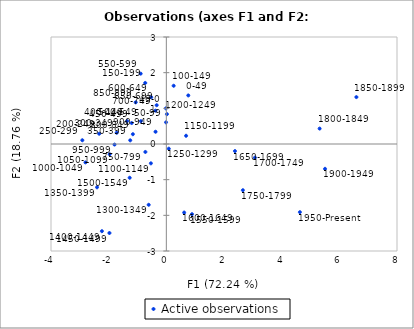
| Category | Active observations |
|---|---|
| 4.632232552843128 | -1.911 |
| 5.503655741676742 | -0.696 |
| 6.591649991115136 | 1.315 |
| 5.31668852765911 | 0.432 |
| 2.6547874400038287 | -1.296 |
| 3.073148568334322 | -0.382 |
| 2.3801209543622783 | -0.199 |
| 0.618510884195647 | -1.922 |
| 0.8901042034635558 | -1.968 |
| -1.2717023809403472 | -0.947 |
| -1.97282665520498 | -2.496 |
| -2.2345798293330223 | -2.444 |
| -2.4031896586763626 | -1.215 |
| -0.611791534692019 | -1.705 |
| 0.08544432340917735 | -0.131 |
| 0.020682502639534528 | 0.836 |
| 0.6845523625213442 | 0.231 |
| -0.5352043023284696 | -0.542 |
| -1.964938678782561 | -0.288 |
| -2.8052542520368706 | -0.516 |
| -1.7968292349972481 | -0.016 |
| -0.3742567763543052 | 0.343 |
| -1.0620765537517154 | 1.169 |
| -1.1602729861632988 | 0.275 |
| -0.7266263144363366 | -0.223 |
| -0.3762568531699714 | 0.935 |
| -0.3348358356199774 | 1.088 |
| -0.5240963940857819 | 1.31 |
| -0.8904020828098197 | 1.972 |
| -0.8828520557043992 | 0.64 |
| -1.203523013785075 | 0.588 |
| -1.361573332242424 | 0.64 |
| -1.2524989800276145 | 0.103 |
| -1.7225226665224314 | 0.315 |
| -2.9132667674569475 | 0.105 |
| -2.328543646770958 | 0.288 |
| -0.7316907143725369 | 1.712 |
| 0.25402314260406844 | 1.632 |
| -0.010436080692818862 | 0.607 |
| -0.01483074153582457 | 0.999 |
| 0.7612771276662558 | 1.362 |